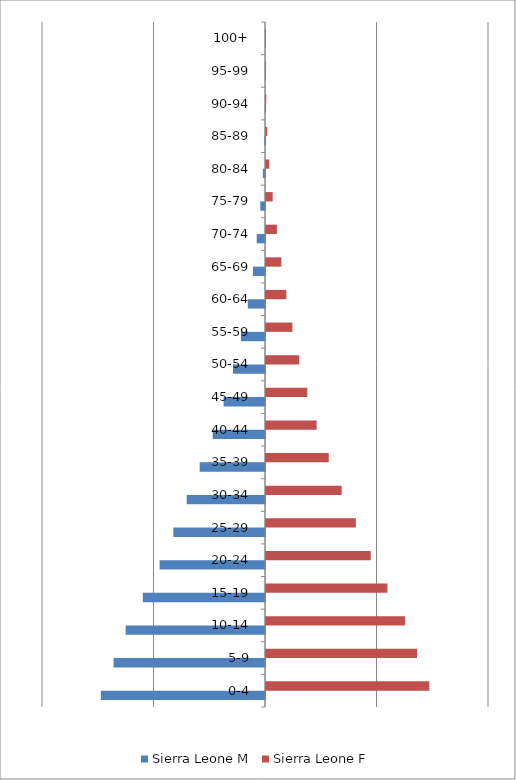
| Category |  Sierra Leone   M  |  Sierra Leone   F  |
|---|---|---|
| 0-4 | -0.074 | 0.073 |
| 5-9 | -0.068 | 0.068 |
| 10-14 | -0.062 | 0.062 |
| 15-19 | -0.055 | 0.054 |
| 20-24 | -0.047 | 0.047 |
| 25-29 | -0.041 | 0.04 |
| 30-34 | -0.035 | 0.034 |
| 35-39 | -0.029 | 0.028 |
| 40-44 | -0.023 | 0.023 |
| 45-49 | -0.019 | 0.019 |
| 50-54 | -0.014 | 0.015 |
| 55-59 | -0.011 | 0.012 |
| 60-64 | -0.008 | 0.009 |
| 65-69 | -0.005 | 0.007 |
| 70-74 | -0.004 | 0.005 |
| 75-79 | -0.002 | 0.003 |
| 80-84 | -0.001 | 0.001 |
| 85-89 | 0 | 0.001 |
| 90-94 | 0 | 0 |
| 95-99 | 0 | 0 |
| 100+ | 0 | 0 |